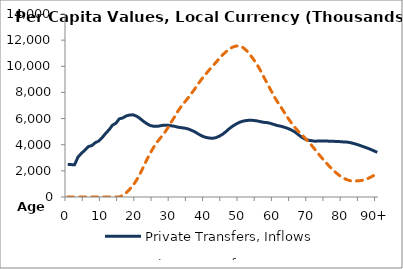
| Category | Private Transfers, Inflows | Private Transfers, Outflows |
|---|---|---|
| 0 | 2479371.096 | 0 |
|  | 2476924.844 | 0 |
| 2 | 2473630.571 | 0 |
| 3 | 3059998.738 | 0 |
| 4 | 3347573.43 | 0 |
| 5 | 3581527.793 | 0 |
| 6 | 3860391.77 | 0 |
| 7 | 3932846.867 | 0 |
| 8 | 4151466.657 | 0 |
| 9 | 4279761.916 | 0 |
| 10 | 4538148.607 | 0 |
| 11 | 4857187.572 | 0 |
| 12 | 5139541.848 | 0 |
| 13 | 5490617.365 | 0 |
| 14 | 5643492.881 | 0 |
| 15 | 5980898.899 | 0 |
| 16 | 6046375.709 | 122562.036 |
| 17 | 6202165.165 | 320042.12 |
| 18 | 6272388.453 | 588617.959 |
| 19 | 6286349.628 | 898150 |
| 20 | 6186489.218 | 1286768.428 |
| 21 | 6009735.645 | 1757055.107 |
| 22 | 5791166.603 | 2301772.349 |
| 23 | 5611930.699 | 2850958.759 |
| 24 | 5466941.957 | 3361550.533 |
| 25 | 5409540.024 | 3812985.916 |
| 26 | 5403517.503 | 4208841.442 |
| 27 | 5453459.61 | 4530875.253 |
| 28 | 5496687.924 | 4856523.046 |
| 29 | 5497945.318 | 5249623.512 |
| 30 | 5450911.128 | 5687020.618 |
| 31 | 5414329.128 | 6104275.096 |
| 32 | 5343916.125 | 6552697.161 |
| 33 | 5304190.405 | 6927027.985 |
| 34 | 5267307.403 | 7254476.956 |
| 35 | 5210420.086 | 7584029.803 |
| 36 | 5100691.614 | 7931116.081 |
| 37 | 4979339.442 | 8291508.324 |
| 38 | 4815745.51 | 8679927.884 |
| 39 | 4671888.394 | 9037896.869 |
| 40 | 4572091.24 | 9355800.26 |
| 41 | 4517043.92 | 9683913.728 |
| 42 | 4490449.922 | 9972521.963 |
| 43 | 4531667.468 | 10268898.025 |
| 44 | 4642864.338 | 10577785.012 |
| 45 | 4792637.248 | 10867279.04 |
| 46 | 5000117.579 | 11101704.707 |
| 47 | 5235085.576 | 11333588 |
| 48 | 5428296.048 | 11473155.912 |
| 49 | 5587025.345 | 11554892.155 |
| 50 | 5717829.39 | 11542107.374 |
| 51 | 5804626.317 | 11430527.249 |
| 52 | 5853317.554 | 11197934.644 |
| 53 | 5872978.039 | 10895361.588 |
| 54 | 5859025.219 | 10539926.404 |
| 55 | 5823192.534 | 10157470.089 |
| 56 | 5765825.385 | 9695422.583 |
| 57 | 5711744.172 | 9183645.354 |
| 58 | 5690516.631 | 8688035.268 |
| 59 | 5627372.352 | 8196738.971 |
| 60 | 5542918.743 | 7697553.865 |
| 61 | 5463295.562 | 7265680.031 |
| 62 | 5413518.034 | 6877676.805 |
| 63 | 5332650.393 | 6461221.207 |
| 64 | 5247933.807 | 6049639.599 |
| 65 | 5128092.632 | 5683384.87 |
| 66 | 4983047.912 | 5334668.417 |
| 67 | 4781193.318 | 5037756.893 |
| 68 | 4575216.747 | 4776322.019 |
| 69 | 4429820.605 | 4506557.555 |
| 70 | 4342996.904 | 4214898.183 |
| 71 | 4298927.034 | 3925534.383 |
| 72 | 4267357.655 | 3594039.668 |
| 73 | 4284579.491 | 3265871.653 |
| 74 | 4279496.247 | 2954006.464 |
| 75 | 4290124.218 | 2655946.494 |
| 76 | 4268115.063 | 2363313.988 |
| 77 | 4268088.492 | 2097611.041 |
| 78 | 4248841.365 | 1857315.287 |
| 79 | 4239229.453 | 1644991.01 |
| 80 | 4215896.185 | 1469438.083 |
| 81 | 4206593.581 | 1338911.44 |
| 82 | 4167338.814 | 1252975.457 |
| 83 | 4103330.453 | 1212825.699 |
| 84 | 4029876.827 | 1232598.134 |
| 85 | 3941303.772 | 1250426.564 |
| 86 | 3844046.202 | 1291245.178 |
| 87 | 3753901.41 | 1370504.775 |
| 88 | 3649338.746 | 1514490.066 |
| 89 | 3533760.954 | 1647249.917 |
| 90+ | 3418183.162 | 1780006.581 |